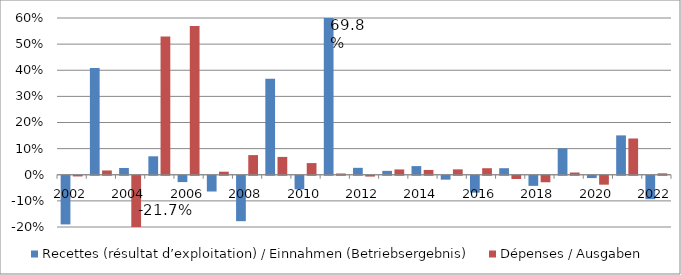
| Category | Recettes (résultat d’exploitation) / Einnahmen (Betriebsergebnis) | Dépenses / Ausgaben |
|---|---|---|
| 2002.0 | -0.186 | -0.003 |
| 2003.0 | 0.408 | 0.016 |
| 2004.0 | 0.026 | -0.217 |
| 2005.0 | 0.071 | 0.529 |
| 2006.0 | -0.024 | 0.569 |
| 2007.0 | -0.06 | 0.012 |
| 2008.0 | -0.174 | 0.075 |
| 2009.0 | 0.368 | 0.068 |
| 2010.0 | -0.052 | 0.045 |
| 2011.0 | 0.698 | 0.005 |
| 2012.0 | 0.027 | -0.003 |
| 2013.0 | 0.015 | 0.02 |
| 2014.0 | 0.033 | 0.018 |
| 2015.0 | -0.015 | 0.021 |
| 2016.0 | -0.065 | 0.025 |
| 2017.0 | 0.025 | -0.012 |
| 2018.0 | -0.039 | -0.025 |
| 2019.0 | 0.101 | 0.009 |
| 2020.0 | -0.009 | -0.034 |
| 2021.0 | 0.151 | 0.139 |
| 2022.0 | -0.09 | 0.005 |